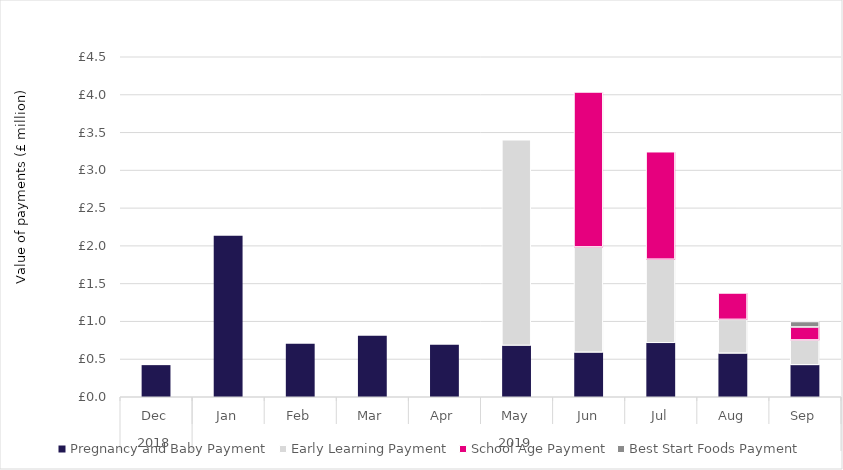
| Category | Pregnancy and Baby Payment | Early Learning Payment | School Age Payment | Best Start Foods Payment |
|---|---|---|---|---|
| 0 | 421800 | 0 | 0 | 0 |
| 1 | 2132700 | 0 | 0 | 0 |
| 2 | 705900 | 0 | 0 | 0 |
| 3 | 811800 | 0 | 0 | 0 |
| 4 | 692400 | 0 | 0 | 0 |
| 5 | 680100 | 2721250 | 0 | 0 |
| 6 | 589800 | 1393250 | 2051000 | 0 |
| 7 | 714000 | 1106500 | 1422500 | 0 |
| 8 | 576900 | 447250 | 349500 | 0 |
| 9 | 422700 | 329000 | 171750 | 72471 |